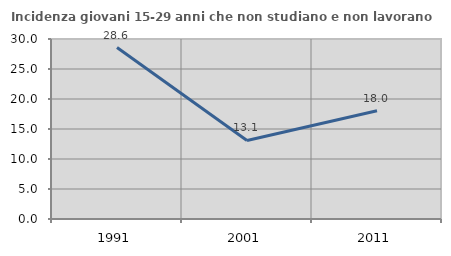
| Category | Incidenza giovani 15-29 anni che non studiano e non lavorano  |
|---|---|
| 1991.0 | 28.571 |
| 2001.0 | 13.094 |
| 2011.0 | 18.047 |